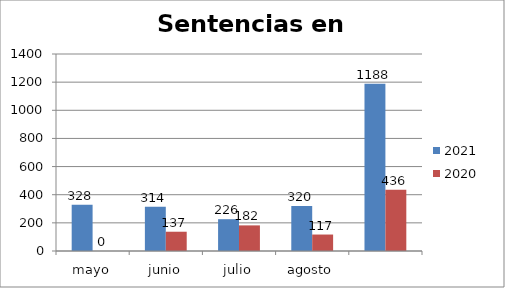
| Category | 2021 | 2020 |
|---|---|---|
| mayo | 328 | 0 |
| junio | 314 | 137 |
| julio | 226 | 182 |
| agosto | 320 | 117 |